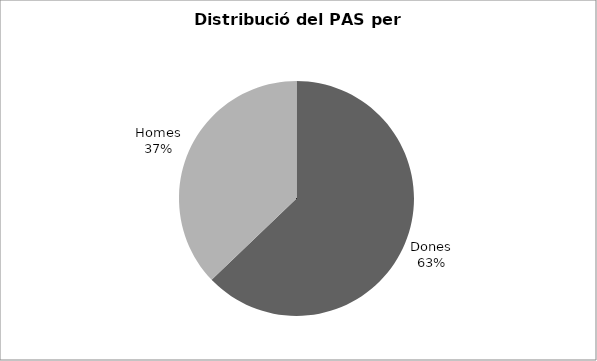
| Category | Series 0 |
|---|---|
| Dones | 1015 |
| Homes | 600 |